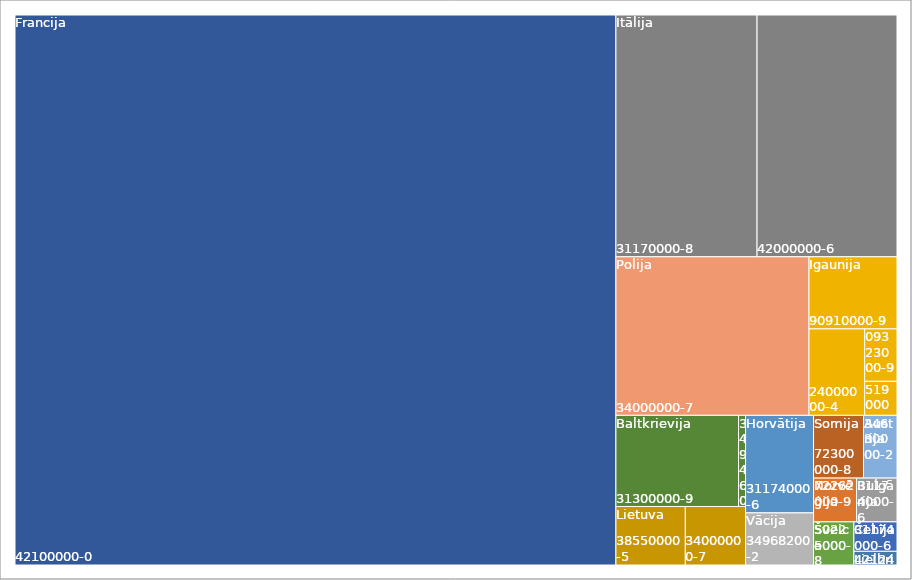
| Category | Vietējie (% no kopējās līgumu summas) | Citas valstis (% no kopējās līgumu summas) |
|---|---|---|
| 2010.gads | 0.394 | 0.606 |
| 2011.gads | 0.816 | 0.184 |
| 2012.gads | 0.526 | 0.474 |
| 2013.gads | 0.629 | 0.371 |
| 2014.gads | 0.78 | 0.22 |
| 2015.gads | 0.579 | 0.421 |